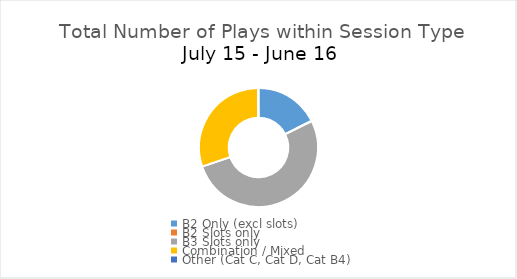
| Category | Series 0 |
|---|---|
| B2 Only (excl slots) | 1885883535 |
| B2 Slots only | 11612316 |
| B3 Slots only | 5583830449 |
| Combination / Mixed | 3218816793 |
| Other (Cat C, Cat D, Cat B4) | 15955092 |